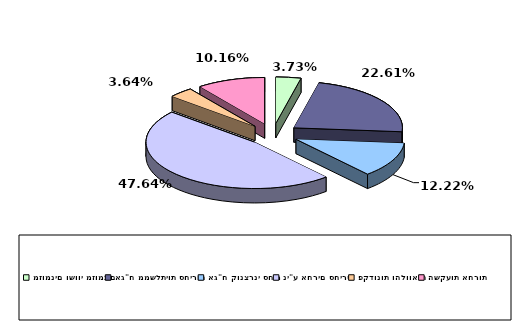
| Category | Series 0 |
|---|---|
| מזומנים ושווי מזומנים | 0.037 |
| אג"ח ממשלתיות סחירות | 0.226 |
| אג"ח קונצרני סחיר | 0.122 |
| ני"ע אחרים סחירים | 0.476 |
| פקדונות והלוואות | 0.036 |
| השקעות אחרות | 0.102 |